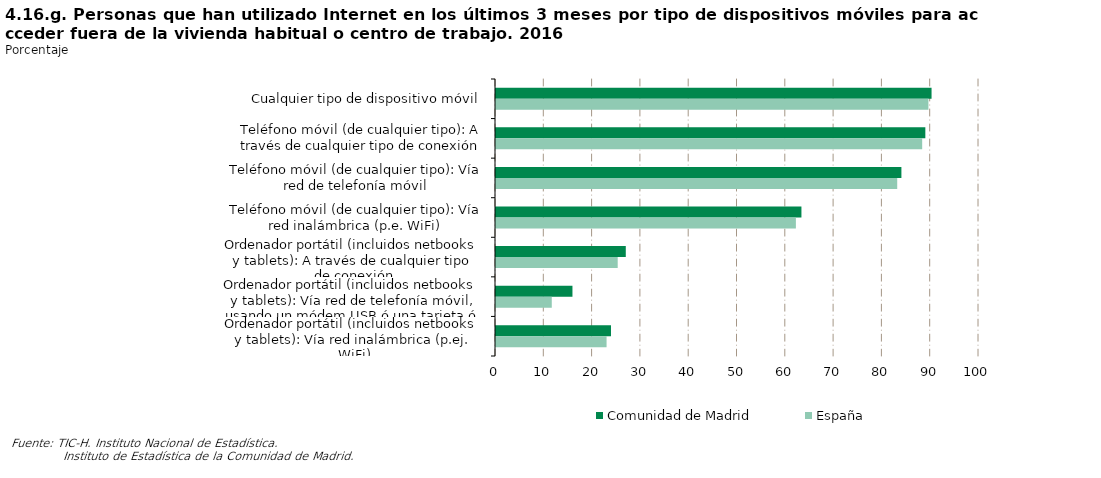
| Category | Comunidad de Madrid | España |
|---|---|---|
| Cualquier tipo de dispositivo móvil | 90.178 | 89.529 |
| Teléfono móvil (de cualquier tipo): A través de cualquier tipo de conexión | 88.89 | 88.237 |
| Teléfono móvil (de cualquier tipo): Vía red de telefonía móvil | 83.936 | 83.067 |
| Teléfono móvil (de cualquier tipo): Vía red inalámbrica (p.e. WiFi) | 63.237 | 62.089 |
| Ordenador portátil (incluidos netbooks  y tablets): A través de cualquier tipo de conexión | 26.87 | 25.199 |
| Ordenador portátil (incluidos netbooks  y tablets): Vía red de telefonía móvil, usando un módem USB ó una tarjeta ó un teléfono móvil como módem | 15.83 | 11.547 |
| Ordenador portátil (incluidos netbooks  y tablets): Vía red inalámbrica (p.ej. WiFi) | 23.808 | 22.891 |